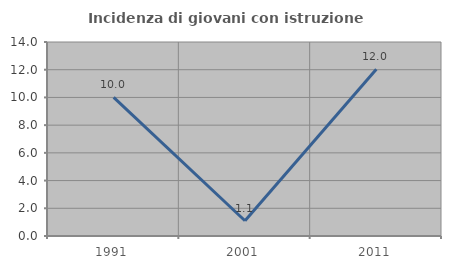
| Category | Incidenza di giovani con istruzione universitaria |
|---|---|
| 1991.0 | 10 |
| 2001.0 | 1.099 |
| 2011.0 | 12.037 |